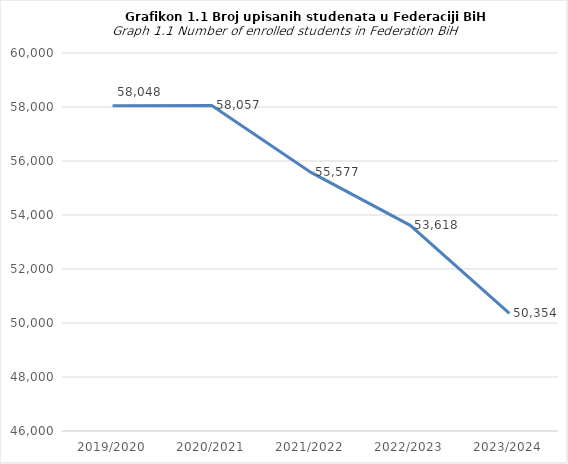
| Category | Series 0 |
|---|---|
| 2019/2020 | 58048 |
| 2020/2021 | 58057 |
| 2021/2022 | 55577 |
| 2022/2023 | 53618 |
| 2023/2024 | 50354 |